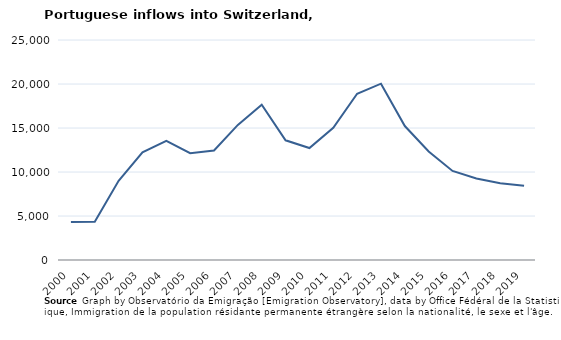
| Category | Entradas |
|---|---|
| 2000.0 | 4311 |
| 2001.0 | 4347 |
| 2002.0 | 9005 |
| 2003.0 | 12228 |
| 2004.0 | 13539 |
| 2005.0 | 12138 |
| 2006.0 | 12441 |
| 2007.0 | 15351 |
| 2008.0 | 17657 |
| 2009.0 | 13601 |
| 2010.0 | 12720 |
| 2011.0 | 15020 |
| 2012.0 | 18892 |
| 2013.0 | 20039 |
| 2014.0 | 15221 |
| 2015.0 | 12325 |
| 2016.0 | 10123 |
| 2017.0 | 9257 |
| 2018.0 | 8733 |
| 2019.0 | 8443 |